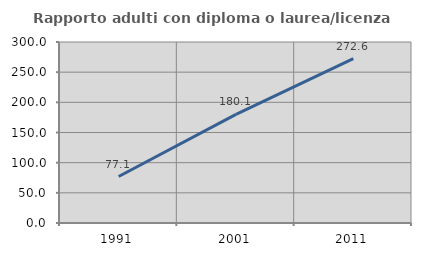
| Category | Rapporto adulti con diploma o laurea/licenza media  |
|---|---|
| 1991.0 | 77.07 |
| 2001.0 | 180.147 |
| 2011.0 | 272.566 |